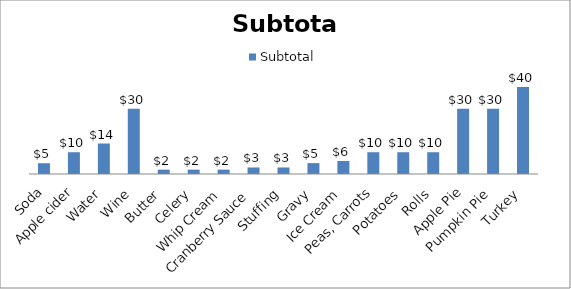
| Category | Subtotal |
|---|---|
| Soda | 4.95 |
| Apple cider | 10 |
| Water | 14 |
| Wine | 30 |
| Butter | 2 |
| Celery | 2 |
| Whip Cream | 2 |
| Cranberry Sauce | 3 |
| Stuffing | 3 |
| Gravy | 5 |
| Ice Cream | 5.99 |
| Peas, Carrots | 10 |
| Potatoes | 10 |
| Rolls | 10 |
| Apple Pie | 30 |
| Pumpkin Pie | 30 |
| Turkey | 40 |